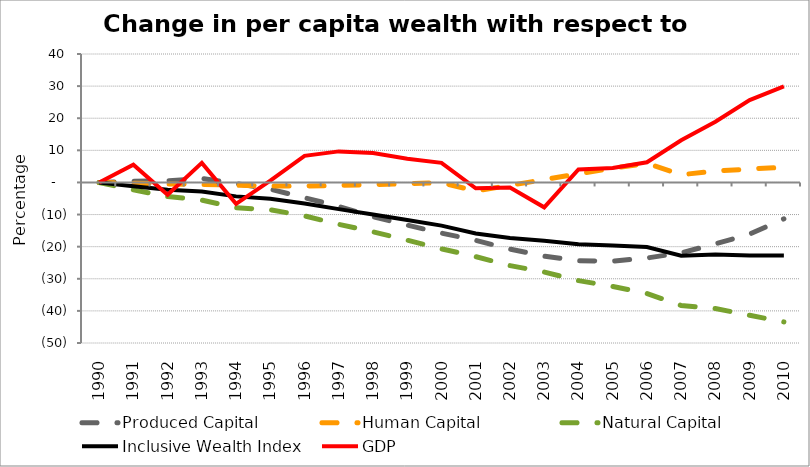
| Category | Produced Capital  | Human Capital | Natural Capital | Inclusive Wealth Index | GDP |
|---|---|---|---|---|---|
| 1990.0 | 0 | 0 | 0 | 0 | 0 |
| 1991.0 | 0.355 | -0.264 | -2.319 | -1.201 | 5.519 |
| 1992.0 | 0.505 | -0.487 | -4.355 | -2.282 | -3.82 |
| 1993.0 | 1.267 | -0.66 | -5.513 | -2.788 | 6.101 |
| 1994.0 | -0.335 | -0.847 | -7.865 | -4.338 | -6.68 |
| 1995.0 | -2.114 | -1.145 | -8.51 | -5.083 | 0.595 |
| 1996.0 | -4.742 | -1.143 | -10.415 | -6.533 | 8.274 |
| 1997.0 | -7.468 | -0.945 | -13.033 | -8.304 | 9.673 |
| 1998.0 | -10.672 | -0.657 | -15.376 | -9.995 | 9.158 |
| 1999.0 | -13.299 | -0.358 | -17.99 | -11.716 | 7.378 |
| 2000.0 | -15.778 | -0.074 | -20.675 | -13.45 | 6.094 |
| 2001.0 | -18.027 | -2.643 | -23.105 | -15.89 | -1.813 |
| 2002.0 | -20.751 | -0.907 | -25.886 | -17.272 | -1.598 |
| 2003.0 | -22.959 | 0.877 | -27.91 | -18.158 | -7.753 |
| 2004.0 | -24.377 | 2.673 | -30.571 | -19.223 | 4.031 |
| 2005.0 | -24.508 | 4.429 | -32.37 | -19.626 | 4.5 |
| 2006.0 | -23.535 | 5.949 | -34.556 | -20.098 | 6.288 |
| 2007.0 | -21.925 | 2.403 | -38.326 | -22.821 | 13.132 |
| 2008.0 | -19.122 | 3.564 | -39.282 | -22.443 | 18.926 |
| 2009.0 | -16.092 | 4.161 | -41.371 | -22.775 | 25.64 |
| 2010.0 | -11.341 | 4.74 | -43.437 | -22.789 | 29.908 |